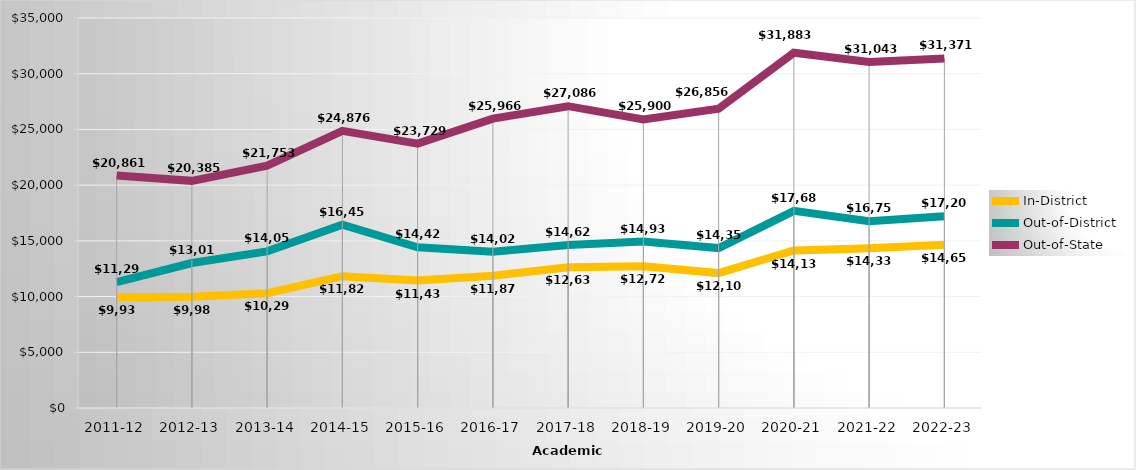
| Category | In-District | Out-of-District | Out-of-State |
|---|---|---|---|
| 2011-12 | 9933.23 | 11297.18 | 20861.23 |
| 2012-13 | 9988.67 | 13011.78 | 20384.67 |
| 2013-14 | 10297.84 | 14057.56 | 21753.28 |
| 2014-15 | 11827.062 | 16453.562 | 24875.688 |
| 2015-16 | 11438 | 14422 | 23729 |
| 2016-17 | 11878 | 14022 | 25966 |
| 2017-18 | 12630 | 14628 | 27086 |
| 2018-19 | 12724 | 14934 | 25900 |
| 2019-20 | 12106 | 14351 | 26856 |
| 2020-21 | 14133 | 17688 | 31883 |
| 2021-22 | 14332 | 16757 | 31043 |
| 2022-23 | 14652 | 17203 | 31371 |